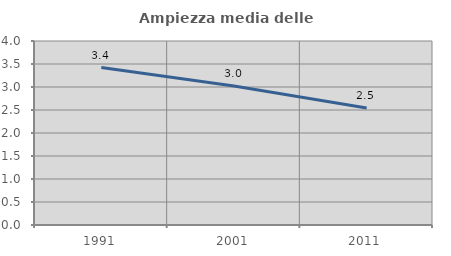
| Category | Ampiezza media delle famiglie |
|---|---|
| 1991.0 | 3.423 |
| 2001.0 | 3.021 |
| 2011.0 | 2.544 |